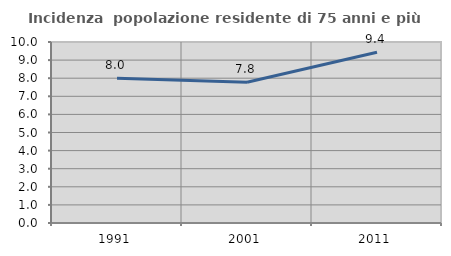
| Category | Incidenza  popolazione residente di 75 anni e più |
|---|---|
| 1991.0 | 7.991 |
| 2001.0 | 7.773 |
| 2011.0 | 9.435 |